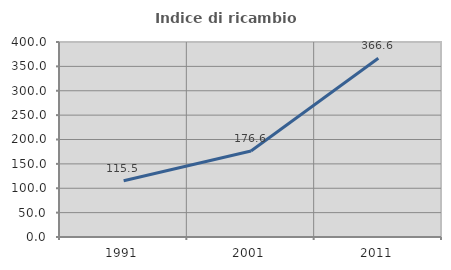
| Category | Indice di ricambio occupazionale  |
|---|---|
| 1991.0 | 115.461 |
| 2001.0 | 176.557 |
| 2011.0 | 366.592 |